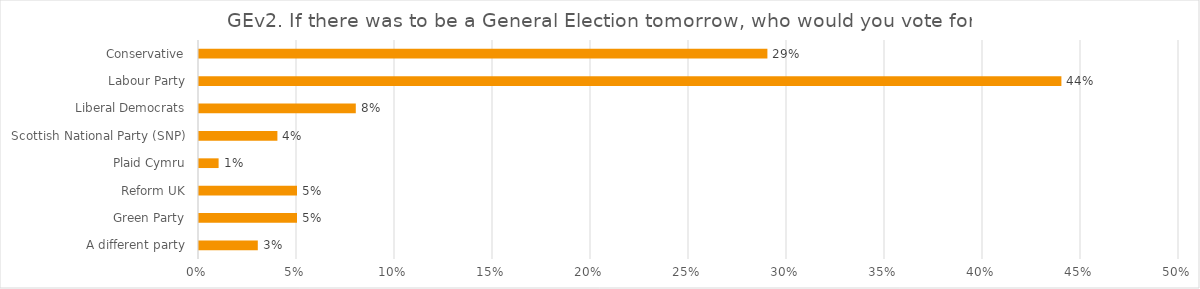
| Category | GEv2. If there was to be a General Election tomorrow, who would you vote for? |
|---|---|
| A different party | 0.03 |
| Green Party | 0.05 |
| Reform UK | 0.05 |
| Plaid Cymru | 0.01 |
| Scottish National Party (SNP) | 0.04 |
| Liberal Democrats | 0.08 |
| Labour Party | 0.44 |
| Conservative | 0.29 |